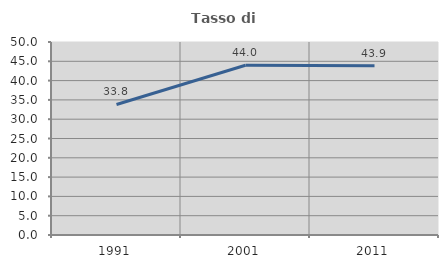
| Category | Tasso di occupazione   |
|---|---|
| 1991.0 | 33.824 |
| 2001.0 | 43.991 |
| 2011.0 | 43.878 |